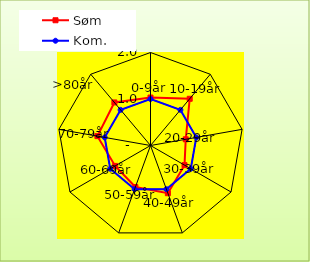
| Category | Søm | Kom. |
|---|---|---|
| 0-9år | 1.031 | 1 |
| 10-19år | 1.312 | 1 |
| 20-29år | 0.769 | 1 |
| 30-39år | 0.845 | 1 |
| 40-49år | 1.092 | 1 |
| 50-59år | 0.951 | 1 |
| 60-69år | 0.877 | 1 |
| 70-79år | 1.159 | 1 |
| >80år | 1.209 | 1 |